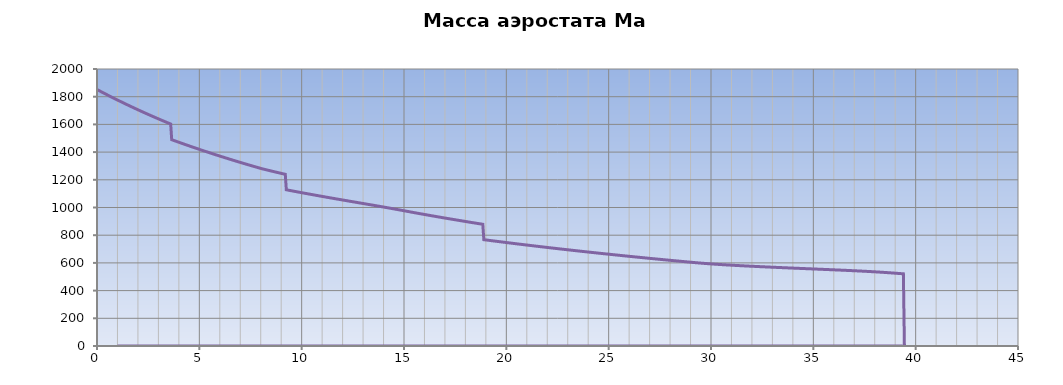
| Category | Масса аэростата Mа [кг] |
|---|---|
| 0.0 | 1851.845 |
| 0.05 | 1847.922 |
| 0.1 | 1844.015 |
| 0.15000000000000002 | 1840.122 |
| 0.2 | 1836.244 |
| 0.25 | 1832.381 |
| 0.3 | 1828.532 |
| 0.35 | 1824.697 |
| 0.39999999999999997 | 1820.877 |
| 0.44999999999999996 | 1817.072 |
| 0.49999999999999994 | 1813.28 |
| 0.5499999999999999 | 1809.503 |
| 0.6 | 1805.74 |
| 0.65 | 1801.99 |
| 0.7000000000000001 | 1798.255 |
| 0.7500000000000001 | 1794.533 |
| 0.8000000000000002 | 1790.825 |
| 0.8500000000000002 | 1787.13 |
| 0.9000000000000002 | 1783.449 |
| 0.9500000000000003 | 1779.782 |
| 1.0000000000000002 | 1776.128 |
| 1.0500000000000003 | 1772.487 |
| 1.1000000000000003 | 1768.859 |
| 1.1500000000000004 | 1765.245 |
| 1.2000000000000004 | 1761.643 |
| 1.2500000000000004 | 1758.055 |
| 1.3000000000000005 | 1754.479 |
| 1.3500000000000005 | 1750.916 |
| 1.4000000000000006 | 1747.366 |
| 1.4500000000000006 | 1743.829 |
| 1.5000000000000007 | 1740.304 |
| 1.5500000000000007 | 1736.791 |
| 1.6000000000000008 | 1733.292 |
| 1.6500000000000008 | 1729.804 |
| 1.7000000000000008 | 1726.329 |
| 1.7500000000000009 | 1722.866 |
| 1.800000000000001 | 1719.415 |
| 1.850000000000001 | 1715.976 |
| 1.900000000000001 | 1712.55 |
| 1.950000000000001 | 1709.135 |
| 2.000000000000001 | 1705.732 |
| 2.0500000000000007 | 1702.341 |
| 2.1000000000000005 | 1698.962 |
| 2.1500000000000004 | 1695.594 |
| 2.2 | 1692.238 |
| 2.25 | 1688.894 |
| 2.3 | 1685.561 |
| 2.3499999999999996 | 1682.24 |
| 2.3999999999999995 | 1678.929 |
| 2.4499999999999993 | 1675.631 |
| 2.499999999999999 | 1672.343 |
| 2.549999999999999 | 1669.067 |
| 2.5999999999999988 | 1665.801 |
| 2.6499999999999986 | 1662.547 |
| 2.6999999999999984 | 1659.304 |
| 2.7499999999999982 | 1656.072 |
| 2.799999999999998 | 1652.85 |
| 2.849999999999998 | 1649.64 |
| 2.8999999999999977 | 1646.44 |
| 2.9499999999999975 | 1643.251 |
| 2.9999999999999973 | 1640.072 |
| 3.049999999999997 | 1636.904 |
| 3.099999999999997 | 1633.747 |
| 3.149999999999997 | 1630.6 |
| 3.1999999999999966 | 1627.463 |
| 3.2499999999999964 | 1624.337 |
| 3.2999999999999963 | 1621.221 |
| 3.349999999999996 | 1618.116 |
| 3.399999999999996 | 1615.02 |
| 3.4499999999999957 | 1611.935 |
| 3.4999999999999956 | 1608.86 |
| 3.5499999999999954 | 1605.795 |
| 3.599999999999995 | 1602.74 |
| 3.649999999999995 | 1489.694 |
| 3.699999999999995 | 1487.003 |
| 3.7499999999999947 | 1484.321 |
| 3.7999999999999945 | 1481.646 |
| 3.8499999999999943 | 1478.979 |
| 3.899999999999994 | 1476.32 |
| 3.949999999999994 | 1473.67 |
| 3.999999999999994 | 1471.027 |
| 4.049999999999994 | 1468.392 |
| 4.099999999999993 | 1465.765 |
| 4.149999999999993 | 1463.145 |
| 4.199999999999993 | 1460.534 |
| 4.249999999999993 | 1457.93 |
| 4.299999999999993 | 1455.334 |
| 4.3499999999999925 | 1452.746 |
| 4.399999999999992 | 1450.165 |
| 4.449999999999992 | 1447.592 |
| 4.499999999999992 | 1445.027 |
| 4.549999999999992 | 1442.469 |
| 4.599999999999992 | 1439.918 |
| 4.6499999999999915 | 1437.375 |
| 4.699999999999991 | 1434.84 |
| 4.749999999999991 | 1432.312 |
| 4.799999999999991 | 1429.791 |
| 4.849999999999991 | 1427.278 |
| 4.899999999999991 | 1424.771 |
| 4.94999999999999 | 1422.273 |
| 4.99999999999999 | 1419.781 |
| 5.04999999999999 | 1417.297 |
| 5.09999999999999 | 1414.819 |
| 5.14999999999999 | 1412.349 |
| 5.1999999999999895 | 1409.886 |
| 5.249999999999989 | 1407.43 |
| 5.299999999999989 | 1404.981 |
| 5.349999999999989 | 1402.539 |
| 5.399999999999989 | 1400.105 |
| 5.449999999999989 | 1397.677 |
| 5.4999999999999885 | 1395.256 |
| 5.549999999999988 | 1392.841 |
| 5.599999999999988 | 1390.434 |
| 5.649999999999988 | 1388.034 |
| 5.699999999999988 | 1385.64 |
| 5.749999999999988 | 1383.253 |
| 5.799999999999987 | 1380.873 |
| 5.849999999999987 | 1378.5 |
| 5.899999999999987 | 1376.133 |
| 5.949999999999987 | 1373.773 |
| 5.999999999999987 | 1371.419 |
| 6.0499999999999865 | 1369.072 |
| 6.099999999999986 | 1366.732 |
| 6.149999999999986 | 1364.398 |
| 6.199999999999986 | 1362.071 |
| 6.249999999999986 | 1359.75 |
| 6.299999999999986 | 1357.436 |
| 6.349999999999985 | 1355.128 |
| 6.399999999999985 | 1352.827 |
| 6.449999999999985 | 1350.532 |
| 6.499999999999985 | 1348.243 |
| 6.549999999999985 | 1345.96 |
| 6.5999999999999845 | 1343.684 |
| 6.649999999999984 | 1341.414 |
| 6.699999999999984 | 1339.151 |
| 6.749999999999984 | 1336.893 |
| 6.799999999999984 | 1334.642 |
| 6.849999999999984 | 1332.397 |
| 6.8999999999999835 | 1330.158 |
| 6.949999999999983 | 1327.925 |
| 6.999999999999983 | 1325.698 |
| 7.049999999999983 | 1323.477 |
| 7.099999999999983 | 1321.263 |
| 7.149999999999983 | 1319.054 |
| 7.199999999999982 | 1316.851 |
| 7.249999999999982 | 1314.654 |
| 7.299999999999982 | 1312.464 |
| 7.349999999999982 | 1310.279 |
| 7.399999999999982 | 1308.1 |
| 7.4499999999999815 | 1305.927 |
| 7.499999999999981 | 1303.759 |
| 7.549999999999981 | 1301.598 |
| 7.599999999999981 | 1299.442 |
| 7.649999999999981 | 1297.292 |
| 7.699999999999981 | 1295.148 |
| 7.7499999999999805 | 1293.009 |
| 7.79999999999998 | 1290.876 |
| 7.84999999999998 | 1288.749 |
| 7.89999999999998 | 1286.628 |
| 7.94999999999998 | 1284.512 |
| 7.99999999999998 | 1282.402 |
| 8.04999999999998 | 1280.297 |
| 8.09999999999998 | 1278.468 |
| 8.14999999999998 | 1276.645 |
| 8.199999999999982 | 1274.828 |
| 8.249999999999982 | 1273.018 |
| 8.299999999999983 | 1271.213 |
| 8.349999999999984 | 1269.415 |
| 8.399999999999984 | 1267.622 |
| 8.449999999999985 | 1265.835 |
| 8.499999999999986 | 1264.054 |
| 8.549999999999986 | 1262.279 |
| 8.599999999999987 | 1260.509 |
| 8.649999999999988 | 1258.745 |
| 8.699999999999989 | 1256.986 |
| 8.74999999999999 | 1255.233 |
| 8.79999999999999 | 1253.485 |
| 8.84999999999999 | 1251.742 |
| 8.899999999999991 | 1250.005 |
| 8.949999999999992 | 1248.273 |
| 8.999999999999993 | 1246.546 |
| 9.049999999999994 | 1244.824 |
| 9.099999999999994 | 1243.108 |
| 9.149999999999995 | 1241.396 |
| 9.199999999999996 | 1239.689 |
| 9.249999999999996 | 1127.987 |
| 9.299999999999997 | 1126.562 |
| 9.349999999999998 | 1125.142 |
| 9.399999999999999 | 1123.725 |
| 9.45 | 1122.311 |
| 9.5 | 1120.902 |
| 9.55 | 1119.496 |
| 9.600000000000001 | 1118.093 |
| 9.650000000000002 | 1116.695 |
| 9.700000000000003 | 1115.299 |
| 9.750000000000004 | 1113.908 |
| 9.800000000000004 | 1112.519 |
| 9.850000000000005 | 1111.134 |
| 9.900000000000006 | 1109.753 |
| 9.950000000000006 | 1108.375 |
| 10.000000000000007 | 1107 |
| 10.050000000000008 | 1105.628 |
| 10.100000000000009 | 1104.26 |
| 10.15000000000001 | 1102.895 |
| 10.20000000000001 | 1101.533 |
| 10.25000000000001 | 1100.174 |
| 10.300000000000011 | 1098.818 |
| 10.350000000000012 | 1097.465 |
| 10.400000000000013 | 1096.115 |
| 10.450000000000014 | 1094.768 |
| 10.500000000000014 | 1093.424 |
| 10.550000000000015 | 1092.082 |
| 10.600000000000016 | 1090.744 |
| 10.650000000000016 | 1089.408 |
| 10.700000000000017 | 1088.075 |
| 10.750000000000018 | 1086.745 |
| 10.800000000000018 | 1085.417 |
| 10.85000000000002 | 1084.092 |
| 10.90000000000002 | 1082.769 |
| 10.95000000000002 | 1081.449 |
| 11.000000000000021 | 1080.132 |
| 11.050000000000022 | 1078.817 |
| 11.100000000000023 | 1077.504 |
| 11.150000000000023 | 1076.194 |
| 11.200000000000024 | 1074.886 |
| 11.250000000000025 | 1073.58 |
| 11.300000000000026 | 1072.276 |
| 11.350000000000026 | 1070.975 |
| 11.400000000000027 | 1069.676 |
| 11.450000000000028 | 1068.379 |
| 11.500000000000028 | 1067.083 |
| 11.55000000000003 | 1065.79 |
| 11.60000000000003 | 1064.499 |
| 11.65000000000003 | 1063.209 |
| 11.700000000000031 | 1061.922 |
| 11.750000000000032 | 1060.636 |
| 11.800000000000033 | 1059.352 |
| 11.850000000000033 | 1058.069 |
| 11.900000000000034 | 1056.788 |
| 11.950000000000035 | 1055.509 |
| 12.000000000000036 | 1054.231 |
| 12.050000000000036 | 1052.955 |
| 12.100000000000037 | 1051.68 |
| 12.150000000000038 | 1050.406 |
| 12.200000000000038 | 1049.133 |
| 12.250000000000039 | 1047.862 |
| 12.30000000000004 | 1046.592 |
| 12.35000000000004 | 1045.323 |
| 12.400000000000041 | 1044.054 |
| 12.450000000000042 | 1042.787 |
| 12.500000000000043 | 1041.52 |
| 12.550000000000043 | 1040.254 |
| 12.600000000000044 | 1038.989 |
| 12.650000000000045 | 1037.724 |
| 12.700000000000045 | 1036.46 |
| 12.750000000000046 | 1035.196 |
| 12.800000000000047 | 1033.933 |
| 12.850000000000048 | 1032.67 |
| 12.900000000000048 | 1031.406 |
| 12.950000000000049 | 1030.143 |
| 13.00000000000005 | 1028.88 |
| 13.05000000000005 | 1027.616 |
| 13.100000000000051 | 1026.352 |
| 13.150000000000052 | 1025.088 |
| 13.200000000000053 | 1023.823 |
| 13.250000000000053 | 1022.557 |
| 13.300000000000054 | 1021.291 |
| 13.350000000000055 | 1020.023 |
| 13.400000000000055 | 1018.755 |
| 13.450000000000056 | 1017.485 |
| 13.500000000000057 | 1016.213 |
| 13.550000000000058 | 1014.941 |
| 13.600000000000058 | 1013.666 |
| 13.650000000000059 | 1012.39 |
| 13.70000000000006 | 1011.111 |
| 13.75000000000006 | 1009.83 |
| 13.800000000000061 | 1008.547 |
| 13.850000000000062 | 1007.261 |
| 13.900000000000063 | 1005.972 |
| 13.950000000000063 | 1004.68 |
| 14.000000000000064 | 1003.385 |
| 14.050000000000065 | 1002.086 |
| 14.100000000000065 | 1000.784 |
| 14.150000000000066 | 999.478 |
| 14.200000000000067 | 998.167 |
| 14.250000000000068 | 996.853 |
| 14.300000000000068 | 995.533 |
| 14.350000000000069 | 994.209 |
| 14.40000000000007 | 992.88 |
| 14.45000000000007 | 991.547 |
| 14.500000000000071 | 990.208 |
| 14.550000000000072 | 988.863 |
| 14.600000000000072 | 987.514 |
| 14.650000000000073 | 986.16 |
| 14.700000000000074 | 984.801 |
| 14.750000000000075 | 983.437 |
| 14.800000000000075 | 982.07 |
| 14.850000000000076 | 980.699 |
| 14.900000000000077 | 979.326 |
| 14.950000000000077 | 977.952 |
| 15.000000000000078 | 976.579 |
| 15.050000000000079 | 975.206 |
| 15.10000000000008 | 973.836 |
| 15.15000000000008 | 972.468 |
| 15.200000000000081 | 971.104 |
| 15.250000000000082 | 969.742 |
| 15.300000000000082 | 968.383 |
| 15.350000000000083 | 967.028 |
| 15.400000000000084 | 965.675 |
| 15.450000000000085 | 964.325 |
| 15.500000000000085 | 962.977 |
| 15.550000000000086 | 961.633 |
| 15.600000000000087 | 960.292 |
| 15.650000000000087 | 958.953 |
| 15.700000000000088 | 957.617 |
| 15.750000000000089 | 956.284 |
| 15.80000000000009 | 954.954 |
| 15.85000000000009 | 953.627 |
| 15.900000000000091 | 952.303 |
| 15.950000000000092 | 950.981 |
| 16.000000000000092 | 949.662 |
| 16.050000000000093 | 948.346 |
| 16.100000000000094 | 947.033 |
| 16.150000000000095 | 945.722 |
| 16.200000000000095 | 944.414 |
| 16.250000000000096 | 943.109 |
| 16.300000000000097 | 941.807 |
| 16.350000000000097 | 940.508 |
| 16.400000000000098 | 939.211 |
| 16.4500000000001 | 937.917 |
| 16.5000000000001 | 936.625 |
| 16.5500000000001 | 935.337 |
| 16.6000000000001 | 934.051 |
| 16.6500000000001 | 932.767 |
| 16.700000000000102 | 931.487 |
| 16.750000000000103 | 930.209 |
| 16.800000000000104 | 928.933 |
| 16.850000000000104 | 927.661 |
| 16.900000000000105 | 926.391 |
| 16.950000000000106 | 925.123 |
| 17.000000000000107 | 923.859 |
| 17.050000000000107 | 922.597 |
| 17.100000000000108 | 921.337 |
| 17.15000000000011 | 920.08 |
| 17.20000000000011 | 918.826 |
| 17.25000000000011 | 917.574 |
| 17.30000000000011 | 916.325 |
| 17.35000000000011 | 915.078 |
| 17.400000000000112 | 913.834 |
| 17.450000000000113 | 912.593 |
| 17.500000000000114 | 911.354 |
| 17.550000000000114 | 910.118 |
| 17.600000000000115 | 908.884 |
| 17.650000000000116 | 907.653 |
| 17.700000000000117 | 906.424 |
| 17.750000000000117 | 905.198 |
| 17.800000000000118 | 903.974 |
| 17.85000000000012 | 902.753 |
| 17.90000000000012 | 901.534 |
| 17.95000000000012 | 900.318 |
| 18.00000000000012 | 899.104 |
| 18.05000000000012 | 897.893 |
| 18.100000000000122 | 896.684 |
| 18.150000000000123 | 895.478 |
| 18.200000000000124 | 894.274 |
| 18.250000000000124 | 893.072 |
| 18.300000000000125 | 891.873 |
| 18.350000000000126 | 890.676 |
| 18.400000000000126 | 889.482 |
| 18.450000000000127 | 888.29 |
| 18.500000000000128 | 887.101 |
| 18.55000000000013 | 885.914 |
| 18.60000000000013 | 884.73 |
| 18.65000000000013 | 883.547 |
| 18.70000000000013 | 882.368 |
| 18.75000000000013 | 881.19 |
| 18.800000000000132 | 880.015 |
| 18.850000000000133 | 878.842 |
| 18.900000000000134 | 767.672 |
| 18.950000000000134 | 766.715 |
| 19.000000000000135 | 765.761 |
| 19.050000000000136 | 764.808 |
| 19.100000000000136 | 763.857 |
| 19.150000000000137 | 762.907 |
| 19.200000000000138 | 761.96 |
| 19.25000000000014 | 761.014 |
| 19.30000000000014 | 760.069 |
| 19.35000000000014 | 759.127 |
| 19.40000000000014 | 758.186 |
| 19.45000000000014 | 757.247 |
| 19.500000000000142 | 756.31 |
| 19.550000000000143 | 755.374 |
| 19.600000000000144 | 754.44 |
| 19.650000000000144 | 753.508 |
| 19.700000000000145 | 752.578 |
| 19.750000000000146 | 751.649 |
| 19.800000000000146 | 750.722 |
| 19.850000000000147 | 749.796 |
| 19.900000000000148 | 748.873 |
| 19.95000000000015 | 747.951 |
| 20.00000000000015 | 747.03 |
| 20.05000000000015 | 746.112 |
| 20.10000000000015 | 745.195 |
| 20.15000000000015 | 744.279 |
| 20.200000000000152 | 743.366 |
| 20.250000000000153 | 742.453 |
| 20.300000000000153 | 741.543 |
| 20.350000000000154 | 740.634 |
| 20.400000000000155 | 739.727 |
| 20.450000000000156 | 738.822 |
| 20.500000000000156 | 737.918 |
| 20.550000000000157 | 737.016 |
| 20.600000000000158 | 736.115 |
| 20.65000000000016 | 735.216 |
| 20.70000000000016 | 734.319 |
| 20.75000000000016 | 733.423 |
| 20.80000000000016 | 732.529 |
| 20.85000000000016 | 731.636 |
| 20.900000000000162 | 730.745 |
| 20.950000000000163 | 729.856 |
| 21.000000000000163 | 728.968 |
| 21.050000000000164 | 728.082 |
| 21.100000000000165 | 727.198 |
| 21.150000000000166 | 726.315 |
| 21.200000000000166 | 725.433 |
| 21.250000000000167 | 724.553 |
| 21.300000000000168 | 723.675 |
| 21.35000000000017 | 722.798 |
| 21.40000000000017 | 721.923 |
| 21.45000000000017 | 721.05 |
| 21.50000000000017 | 720.178 |
| 21.55000000000017 | 719.307 |
| 21.600000000000172 | 718.438 |
| 21.650000000000173 | 717.571 |
| 21.700000000000173 | 716.705 |
| 21.750000000000174 | 715.841 |
| 21.800000000000175 | 714.978 |
| 21.850000000000176 | 714.117 |
| 21.900000000000176 | 713.257 |
| 21.950000000000177 | 712.399 |
| 22.000000000000178 | 711.542 |
| 22.05000000000018 | 710.687 |
| 22.10000000000018 | 709.833 |
| 22.15000000000018 | 708.981 |
| 22.20000000000018 | 708.13 |
| 22.25000000000018 | 707.281 |
| 22.300000000000182 | 706.433 |
| 22.350000000000183 | 705.587 |
| 22.400000000000183 | 704.742 |
| 22.450000000000184 | 703.899 |
| 22.500000000000185 | 703.057 |
| 22.550000000000185 | 702.217 |
| 22.600000000000186 | 701.378 |
| 22.650000000000187 | 700.541 |
| 22.700000000000188 | 699.705 |
| 22.75000000000019 | 698.871 |
| 22.80000000000019 | 698.038 |
| 22.85000000000019 | 697.206 |
| 22.90000000000019 | 696.376 |
| 22.95000000000019 | 695.547 |
| 23.000000000000192 | 694.72 |
| 23.050000000000193 | 693.895 |
| 23.100000000000193 | 693.07 |
| 23.150000000000194 | 692.247 |
| 23.200000000000195 | 691.426 |
| 23.250000000000195 | 690.606 |
| 23.300000000000196 | 689.787 |
| 23.350000000000197 | 688.97 |
| 23.400000000000198 | 688.155 |
| 23.4500000000002 | 687.34 |
| 23.5000000000002 | 686.527 |
| 23.5500000000002 | 685.716 |
| 23.6000000000002 | 684.906 |
| 23.6500000000002 | 684.097 |
| 23.700000000000202 | 683.29 |
| 23.750000000000203 | 682.484 |
| 23.800000000000203 | 681.679 |
| 23.850000000000204 | 680.876 |
| 23.900000000000205 | 680.074 |
| 23.950000000000205 | 679.274 |
| 24.000000000000206 | 678.475 |
| 24.050000000000207 | 677.677 |
| 24.100000000000207 | 676.881 |
| 24.150000000000208 | 676.086 |
| 24.20000000000021 | 675.292 |
| 24.25000000000021 | 674.5 |
| 24.30000000000021 | 673.709 |
| 24.35000000000021 | 672.92 |
| 24.40000000000021 | 672.132 |
| 24.450000000000212 | 671.345 |
| 24.500000000000213 | 670.56 |
| 24.550000000000214 | 669.775 |
| 24.600000000000215 | 668.993 |
| 24.650000000000215 | 668.211 |
| 24.700000000000216 | 667.431 |
| 24.750000000000217 | 666.652 |
| 24.800000000000217 | 665.875 |
| 24.850000000000218 | 665.099 |
| 24.90000000000022 | 664.324 |
| 24.95000000000022 | 663.551 |
| 25.00000000000022 | 662.778 |
| 25.05000000000022 | 662.008 |
| 25.10000000000022 | 661.238 |
| 25.150000000000222 | 660.47 |
| 25.200000000000223 | 659.703 |
| 25.250000000000224 | 658.937 |
| 25.300000000000225 | 658.173 |
| 25.350000000000225 | 657.41 |
| 25.400000000000226 | 656.648 |
| 25.450000000000227 | 655.887 |
| 25.500000000000227 | 655.128 |
| 25.550000000000228 | 654.37 |
| 25.60000000000023 | 653.613 |
| 25.65000000000023 | 652.858 |
| 25.70000000000023 | 652.104 |
| 25.75000000000023 | 651.351 |
| 25.80000000000023 | 650.6 |
| 25.850000000000232 | 649.849 |
| 25.900000000000233 | 649.1 |
| 25.950000000000234 | 648.352 |
| 26.000000000000234 | 647.606 |
| 26.050000000000235 | 646.86 |
| 26.100000000000236 | 646.116 |
| 26.150000000000237 | 645.373 |
| 26.200000000000237 | 644.632 |
| 26.250000000000238 | 643.892 |
| 26.30000000000024 | 643.152 |
| 26.35000000000024 | 642.415 |
| 26.40000000000024 | 641.678 |
| 26.45000000000024 | 640.942 |
| 26.50000000000024 | 640.208 |
| 26.550000000000242 | 639.475 |
| 26.600000000000243 | 638.744 |
| 26.650000000000244 | 638.013 |
| 26.700000000000244 | 637.284 |
| 26.750000000000245 | 636.556 |
| 26.800000000000246 | 635.829 |
| 26.850000000000247 | 635.103 |
| 26.900000000000247 | 634.378 |
| 26.950000000000248 | 633.655 |
| 27.00000000000025 | 632.933 |
| 27.05000000000025 | 632.212 |
| 27.10000000000025 | 631.492 |
| 27.15000000000025 | 630.774 |
| 27.20000000000025 | 630.056 |
| 27.250000000000252 | 629.34 |
| 27.300000000000253 | 628.625 |
| 27.350000000000254 | 627.911 |
| 27.400000000000254 | 627.199 |
| 27.450000000000255 | 626.487 |
| 27.500000000000256 | 625.777 |
| 27.550000000000257 | 625.068 |
| 27.600000000000257 | 624.36 |
| 27.650000000000258 | 623.653 |
| 27.70000000000026 | 622.948 |
| 27.75000000000026 | 622.243 |
| 27.80000000000026 | 621.54 |
| 27.85000000000026 | 620.838 |
| 27.90000000000026 | 620.137 |
| 27.950000000000262 | 619.437 |
| 28.000000000000263 | 618.738 |
| 28.050000000000264 | 618.04 |
| 28.100000000000264 | 617.344 |
| 28.150000000000265 | 616.648 |
| 28.200000000000266 | 615.954 |
| 28.250000000000266 | 615.261 |
| 28.300000000000267 | 614.569 |
| 28.350000000000268 | 613.878 |
| 28.40000000000027 | 613.189 |
| 28.45000000000027 | 612.5 |
| 28.50000000000027 | 611.813 |
| 28.55000000000027 | 611.126 |
| 28.60000000000027 | 610.441 |
| 28.650000000000272 | 609.757 |
| 28.700000000000273 | 609.074 |
| 28.750000000000274 | 608.392 |
| 28.800000000000274 | 607.711 |
| 28.850000000000275 | 607.032 |
| 28.900000000000276 | 606.353 |
| 28.950000000000276 | 605.676 |
| 29.000000000000277 | 604.999 |
| 29.050000000000278 | 604.325 |
| 29.10000000000028 | 603.653 |
| 29.15000000000028 | 602.986 |
| 29.20000000000028 | 602.323 |
| 29.25000000000028 | 601.667 |
| 29.30000000000028 | 601.017 |
| 29.350000000000282 | 600.376 |
| 29.400000000000283 | 599.743 |
| 29.450000000000284 | 599.119 |
| 29.500000000000284 | 598.504 |
| 29.550000000000285 | 597.898 |
| 29.600000000000286 | 597.301 |
| 29.650000000000286 | 596.712 |
| 29.700000000000287 | 596.133 |
| 29.750000000000288 | 595.563 |
| 29.80000000000029 | 595 |
| 29.85000000000029 | 594.447 |
| 29.90000000000029 | 593.901 |
| 29.95000000000029 | 593.363 |
| 30.00000000000029 | 592.833 |
| 30.050000000000292 | 592.31 |
| 30.100000000000293 | 591.794 |
| 30.150000000000293 | 591.286 |
| 30.200000000000294 | 590.784 |
| 30.250000000000295 | 590.288 |
| 30.300000000000296 | 589.799 |
| 30.350000000000296 | 589.315 |
| 30.400000000000297 | 588.838 |
| 30.450000000000298 | 588.366 |
| 30.5000000000003 | 587.9 |
| 30.5500000000003 | 587.439 |
| 30.6000000000003 | 586.983 |
| 30.6500000000003 | 586.532 |
| 30.7000000000003 | 586.086 |
| 30.750000000000302 | 585.645 |
| 30.800000000000303 | 585.208 |
| 30.850000000000303 | 584.775 |
| 30.900000000000304 | 584.347 |
| 30.950000000000305 | 583.922 |
| 31.000000000000306 | 583.502 |
| 31.050000000000306 | 583.085 |
| 31.100000000000307 | 582.672 |
| 31.150000000000308 | 582.263 |
| 31.20000000000031 | 581.857 |
| 31.25000000000031 | 581.455 |
| 31.30000000000031 | 581.056 |
| 31.35000000000031 | 580.66 |
| 31.40000000000031 | 580.267 |
| 31.450000000000312 | 579.877 |
| 31.500000000000313 | 579.49 |
| 31.550000000000313 | 579.105 |
| 31.600000000000314 | 578.724 |
| 31.650000000000315 | 578.345 |
| 31.700000000000315 | 577.969 |
| 31.750000000000316 | 577.595 |
| 31.800000000000317 | 577.224 |
| 31.850000000000318 | 576.855 |
| 31.90000000000032 | 576.488 |
| 31.95000000000032 | 576.124 |
| 32.00000000000032 | 575.761 |
| 32.05000000000032 | 575.401 |
| 32.100000000000314 | 575.043 |
| 32.15000000000031 | 574.687 |
| 32.20000000000031 | 574.333 |
| 32.250000000000306 | 573.98 |
| 32.3000000000003 | 573.63 |
| 32.3500000000003 | 573.281 |
| 32.4000000000003 | 572.934 |
| 32.450000000000294 | 572.588 |
| 32.50000000000029 | 572.245 |
| 32.55000000000029 | 571.903 |
| 32.600000000000286 | 571.562 |
| 32.65000000000028 | 571.223 |
| 32.70000000000028 | 570.885 |
| 32.75000000000028 | 570.549 |
| 32.800000000000274 | 570.214 |
| 32.85000000000027 | 569.88 |
| 32.90000000000027 | 569.548 |
| 32.950000000000266 | 569.217 |
| 33.00000000000026 | 568.887 |
| 33.05000000000026 | 568.558 |
| 33.10000000000026 | 568.23 |
| 33.150000000000254 | 567.904 |
| 33.20000000000025 | 567.578 |
| 33.25000000000025 | 567.254 |
| 33.300000000000246 | 566.93 |
| 33.35000000000024 | 566.608 |
| 33.40000000000024 | 566.286 |
| 33.45000000000024 | 565.965 |
| 33.500000000000234 | 565.645 |
| 33.55000000000023 | 565.326 |
| 33.60000000000023 | 565.008 |
| 33.650000000000226 | 564.69 |
| 33.70000000000022 | 564.373 |
| 33.75000000000022 | 564.057 |
| 33.80000000000022 | 563.742 |
| 33.850000000000215 | 563.427 |
| 33.90000000000021 | 563.113 |
| 33.95000000000021 | 562.799 |
| 34.000000000000206 | 562.486 |
| 34.0500000000002 | 562.173 |
| 34.1000000000002 | 561.861 |
| 34.1500000000002 | 561.549 |
| 34.200000000000195 | 561.238 |
| 34.25000000000019 | 560.927 |
| 34.30000000000019 | 560.616 |
| 34.350000000000186 | 560.306 |
| 34.40000000000018 | 559.996 |
| 34.45000000000018 | 559.686 |
| 34.50000000000018 | 559.376 |
| 34.550000000000175 | 559.067 |
| 34.60000000000017 | 558.758 |
| 34.65000000000017 | 558.449 |
| 34.700000000000166 | 558.14 |
| 34.75000000000016 | 557.831 |
| 34.80000000000016 | 557.522 |
| 34.85000000000016 | 557.213 |
| 34.900000000000155 | 556.904 |
| 34.95000000000015 | 556.595 |
| 35.00000000000015 | 556.286 |
| 35.050000000000146 | 555.977 |
| 35.10000000000014 | 555.667 |
| 35.15000000000014 | 555.358 |
| 35.20000000000014 | 555.048 |
| 35.250000000000135 | 554.738 |
| 35.30000000000013 | 554.427 |
| 35.35000000000013 | 554.117 |
| 35.40000000000013 | 553.806 |
| 35.450000000000124 | 553.494 |
| 35.50000000000012 | 553.182 |
| 35.55000000000012 | 552.869 |
| 35.600000000000115 | 552.556 |
| 35.65000000000011 | 552.242 |
| 35.70000000000011 | 551.928 |
| 35.75000000000011 | 551.613 |
| 35.800000000000104 | 551.297 |
| 35.8500000000001 | 550.981 |
| 35.9000000000001 | 550.663 |
| 35.950000000000095 | 550.345 |
| 36.00000000000009 | 550.026 |
| 36.05000000000009 | 549.705 |
| 36.10000000000009 | 549.384 |
| 36.150000000000084 | 549.062 |
| 36.20000000000008 | 548.738 |
| 36.25000000000008 | 548.413 |
| 36.300000000000075 | 548.087 |
| 36.35000000000007 | 547.76 |
| 36.40000000000007 | 547.431 |
| 36.45000000000007 | 547.101 |
| 36.500000000000064 | 546.769 |
| 36.55000000000006 | 546.436 |
| 36.60000000000006 | 546.101 |
| 36.650000000000055 | 545.764 |
| 36.70000000000005 | 545.425 |
| 36.75000000000005 | 545.085 |
| 36.80000000000005 | 544.742 |
| 36.850000000000044 | 544.397 |
| 36.90000000000004 | 544.05 |
| 36.95000000000004 | 543.701 |
| 37.000000000000036 | 543.349 |
| 37.05000000000003 | 542.995 |
| 37.10000000000003 | 542.638 |
| 37.15000000000003 | 542.278 |
| 37.200000000000024 | 541.916 |
| 37.25000000000002 | 541.551 |
| 37.30000000000002 | 541.182 |
| 37.350000000000016 | 540.811 |
| 37.40000000000001 | 540.436 |
| 37.45000000000001 | 540.057 |
| 37.50000000000001 | 539.675 |
| 37.550000000000004 | 539.289 |
| 37.6 | 538.899 |
| 37.65 | 538.505 |
| 37.699999999999996 | 538.106 |
| 37.74999999999999 | 537.703 |
| 37.79999999999999 | 537.296 |
| 37.84999999999999 | 536.883 |
| 37.899999999999984 | 536.466 |
| 37.94999999999998 | 536.043 |
| 37.99999999999998 | 535.615 |
| 38.049999999999976 | 535.181 |
| 38.09999999999997 | 534.741 |
| 38.14999999999997 | 534.295 |
| 38.19999999999997 | 533.843 |
| 38.249999999999964 | 533.385 |
| 38.29999999999996 | 532.919 |
| 38.34999999999996 | 532.447 |
| 38.399999999999956 | 531.968 |
| 38.44999999999995 | 531.481 |
| 38.49999999999995 | 530.987 |
| 38.54999999999995 | 530.486 |
| 38.599999999999945 | 529.978 |
| 38.64999999999994 | 529.462 |
| 38.69999999999994 | 528.939 |
| 38.749999999999936 | 528.41 |
| 38.79999999999993 | 527.875 |
| 38.84999999999993 | 527.335 |
| 38.89999999999993 | 526.79 |
| 38.949999999999925 | 526.242 |
| 38.99999999999992 | 525.692 |
| 39.04999999999992 | 525.141 |
| 39.099999999999916 | 524.59 |
| 39.14999999999991 | 524.039 |
| 39.19999999999991 | 523.49 |
| 39.24999999999991 | 522.941 |
| 39.299999999999905 | 522.394 |
| 39.3499999999999 | 521.847 |
| 39.3999999999999 | 521.301 |
| 39.449999999999896 | 0 |
| 1.0 | 0 |
| 1.0 | 0 |
| 1.0 | 0 |
| 1.0 | 0 |
| 1.0 | 0 |
| 1.0 | 0 |
| 1.0 | 0 |
| 1.0 | 0 |
| 1.0 | 0 |
| 1.0 | 0 |
| 1.0 | 0 |
| 1.0 | 0 |
| 1.0 | 0 |
| 1.0 | 0 |
| 1.0 | 0 |
| 1.0 | 0 |
| 1.0 | 0 |
| 1.0 | 0 |
| 1.0 | 0 |
| 1.0 | 0 |
| 1.0 | 0 |
| 1.0 | 0 |
| 1.0 | 0 |
| 1.0 | 0 |
| 1.0 | 0 |
| 1.0 | 0 |
| 1.0 | 0 |
| 1.0 | 0 |
| 1.0 | 0 |
| 1.0 | 0 |
| 1.0 | 0 |
| 1.0 | 0 |
| 1.0 | 0 |
| 1.0 | 0 |
| 1.0 | 0 |
| 1.0 | 0 |
| 1.0 | 0 |
| 1.0 | 0 |
| 1.0 | 0 |
| 1.0 | 0 |
| 1.0 | 0 |
| 1.0 | 0 |
| 1.0 | 0 |
| 1.0 | 0 |
| 1.0 | 0 |
| 1.0 | 0 |
| 1.0 | 0 |
| 1.0 | 0 |
| 1.0 | 0 |
| 1.0 | 0 |
| 1.0 | 0 |
| 1.0 | 0 |
| 1.0 | 0 |
| 1.0 | 0 |
| 1.0 | 0 |
| 1.0 | 0 |
| 1.0 | 0 |
| 1.0 | 0 |
| 1.0 | 0 |
| 1.0 | 0 |
| 1.0 | 0 |
| 1.0 | 0 |
| 1.0 | 0 |
| 1.0 | 0 |
| 1.0 | 0 |
| 1.0 | 0 |
| 1.0 | 0 |
| 1.0 | 0 |
| 1.0 | 0 |
| 1.0 | 0 |
| 1.0 | 0 |
| 1.0 | 0 |
| 1.0 | 0 |
| 1.0 | 0 |
| 1.0 | 0 |
| 1.0 | 0 |
| 1.0 | 0 |
| 1.0 | 0 |
| 1.0 | 0 |
| 1.0 | 0 |
| 1.0 | 0 |
| 1.0 | 0 |
| 1.0 | 0 |
| 1.0 | 0 |
| 1.0 | 0 |
| 1.0 | 0 |
| 1.0 | 0 |
| 1.0 | 0 |
| 1.0 | 0 |
| 1.0 | 0 |
| 1.0 | 0 |
| 1.0 | 0 |
| 1.0 | 0 |
| 1.0 | 0 |
| 1.0 | 0 |
| 1.0 | 0 |
| 1.0 | 0 |
| 1.0 | 0 |
| 1.0 | 0 |
| 1.0 | 0 |
| 1.0 | 0 |
| 1.0 | 0 |
| 1.0 | 0 |
| 1.0 | 0 |
| 1.0 | 0 |
| 1.0 | 0 |
| 1.0 | 0 |
| 1.0 | 0 |
| 1.0 | 0 |
| 1.0 | 0 |
| 1.0 | 0 |
| 1.0 | 0 |
| 1.0 | 0 |
| 1.0 | 0 |
| 1.0 | 0 |
| 1.0 | 0 |
| 1.0 | 0 |
| 1.0 | 0 |
| 1.0 | 0 |
| 1.0 | 0 |
| 1.0 | 0 |
| 1.0 | 0 |
| 1.0 | 0 |
| 1.0 | 0 |
| 1.0 | 0 |
| 1.0 | 0 |
| 1.0 | 0 |
| 1.0 | 0 |
| 1.0 | 0 |
| 1.0 | 0 |
| 1.0 | 0 |
| 1.0 | 0 |
| 1.0 | 0 |
| 1.0 | 0 |
| 1.0 | 0 |
| 1.0 | 0 |
| 1.0 | 0 |
| 1.0 | 0 |
| 1.0 | 0 |
| 1.0 | 0 |
| 1.0 | 0 |
| 1.0 | 0 |
| 1.0 | 0 |
| 1.0 | 0 |
| 1.0 | 0 |
| 1.0 | 0 |
| 1.0 | 0 |
| 1.0 | 0 |
| 1.0 | 0 |
| 1.0 | 0 |
| 1.0 | 0 |
| 1.0 | 0 |
| 1.0 | 0 |
| 1.0 | 0 |
| 1.0 | 0 |
| 1.0 | 0 |
| 1.0 | 0 |
| 1.0 | 0 |
| 1.0 | 0 |
| 1.0 | 0 |
| 1.0 | 0 |
| 1.0 | 0 |
| 1.0 | 0 |
| 1.0 | 0 |
| 1.0 | 0 |
| 1.0 | 0 |
| 1.0 | 0 |
| 1.0 | 0 |
| 1.0 | 0 |
| 1.0 | 0 |
| 1.0 | 0 |
| 1.0 | 0 |
| 1.0 | 0 |
| 1.0 | 0 |
| 1.0 | 0 |
| 1.0 | 0 |
| 1.0 | 0 |
| 1.0 | 0 |
| 1.0 | 0 |
| 1.0 | 0 |
| 1.0 | 0 |
| 1.0 | 0 |
| 1.0 | 0 |
| 1.0 | 0 |
| 1.0 | 0 |
| 1.0 | 0 |
| 1.0 | 0 |
| 1.0 | 0 |
| 1.0 | 0 |
| 1.0 | 0 |
| 1.0 | 0 |
| 1.0 | 0 |
| 1.0 | 0 |
| 1.0 | 0 |
| 1.0 | 0 |
| 1.0 | 0 |
| 1.0 | 0 |
| 1.0 | 0 |
| 1.0 | 0 |
| 1.0 | 0 |
| 1.0 | 0 |
| 1.0 | 0 |
| 1.0 | 0 |
| 1.0 | 0 |
| 1.0 | 0 |
| 1.0 | 0 |
| 1.0 | 0 |
| 1.0 | 0 |
| 1.0 | 0 |
| 1.0 | 0 |
| 1.0 | 0 |
| 1.0 | 0 |
| 1.0 | 0 |
| 1.0 | 0 |
| 1.0 | 0 |
| 1.0 | 0 |
| 1.0 | 0 |
| 1.0 | 0 |
| 1.0 | 0 |
| 1.0 | 0 |
| 1.0 | 0 |
| 1.0 | 0 |
| 1.0 | 0 |
| 1.0 | 0 |
| 1.0 | 0 |
| 1.0 | 0 |
| 1.0 | 0 |
| 1.0 | 0 |
| 1.0 | 0 |
| 1.0 | 0 |
| 1.0 | 0 |
| 1.0 | 0 |
| 1.0 | 0 |
| 1.0 | 0 |
| 1.0 | 0 |
| 1.0 | 0 |
| 1.0 | 0 |
| 1.0 | 0 |
| 1.0 | 0 |
| 1.0 | 0 |
| 1.0 | 0 |
| 1.0 | 0 |
| 1.0 | 0 |
| 1.0 | 0 |
| 1.0 | 0 |
| 1.0 | 0 |
| 1.0 | 0 |
| 1.0 | 0 |
| 1.0 | 0 |
| 1.0 | 0 |
| 1.0 | 0 |
| 1.0 | 0 |
| 1.0 | 0 |
| 1.0 | 0 |
| 1.0 | 0 |
| 1.0 | 0 |
| 1.0 | 0 |
| 1.0 | 0 |
| 1.0 | 0 |
| 1.0 | 0 |
| 1.0 | 0 |
| 1.0 | 0 |
| 1.0 | 0 |
| 1.0 | 0 |
| 1.0 | 0 |
| 1.0 | 0 |
| 1.0 | 0 |
| 1.0 | 0 |
| 1.0 | 0 |
| 1.0 | 0 |
| 1.0 | 0 |
| 1.0 | 0 |
| 1.0 | 0 |
| 1.0 | 0 |
| 1.0 | 0 |
| 1.0 | 0 |
| 1.0 | 0 |
| 1.0 | 0 |
| 1.0 | 0 |
| 1.0 | 0 |
| 1.0 | 0 |
| 1.0 | 0 |
| 1.0 | 0 |
| 1.0 | 0 |
| 1.0 | 0 |
| 1.0 | 0 |
| 1.0 | 0 |
| 1.0 | 0 |
| 1.0 | 0 |
| 1.0 | 0 |
| 1.0 | 0 |
| 1.0 | 0 |
| 1.0 | 0 |
| 1.0 | 0 |
| 1.0 | 0 |
| 1.0 | 0 |
| 1.0 | 0 |
| 1.0 | 0 |
| 1.0 | 0 |
| 1.0 | 0 |
| 1.0 | 0 |
| 1.0 | 0 |
| 1.0 | 0 |
| 1.0 | 0 |
| 1.0 | 0 |
| 1.0 | 0 |
| 1.0 | 0 |
| 1.0 | 0 |
| 1.0 | 0 |
| 1.0 | 0 |
| 1.0 | 0 |
| 1.0 | 0 |
| 1.0 | 0 |
| 1.0 | 0 |
| 1.0 | 0 |
| 1.0 | 0 |
| 1.0 | 0 |
| 1.0 | 0 |
| 1.0 | 0 |
| 1.0 | 0 |
| 1.0 | 0 |
| 1.0 | 0 |
| 1.0 | 0 |
| 1.0 | 0 |
| 1.0 | 0 |
| 1.0 | 0 |
| 1.0 | 0 |
| 1.0 | 0 |
| 1.0 | 0 |
| 1.0 | 0 |
| 1.0 | 0 |
| 1.0 | 0 |
| 1.0 | 0 |
| 1.0 | 0 |
| 1.0 | 0 |
| 1.0 | 0 |
| 1.0 | 0 |
| 1.0 | 0 |
| 1.0 | 0 |
| 1.0 | 0 |
| 1.0 | 0 |
| 1.0 | 0 |
| 1.0 | 0 |
| 1.0 | 0 |
| 1.0 | 0 |
| 1.0 | 0 |
| 1.0 | 0 |
| 1.0 | 0 |
| 1.0 | 0 |
| 1.0 | 0 |
| 1.0 | 0 |
| 1.0 | 0 |
| 1.0 | 0 |
| 1.0 | 0 |
| 1.0 | 0 |
| 1.0 | 0 |
| 1.0 | 0 |
| 1.0 | 0 |
| 1.0 | 0 |
| 1.0 | 0 |
| 1.0 | 0 |
| 1.0 | 0 |
| 1.0 | 0 |
| 1.0 | 0 |
| 1.0 | 0 |
| 1.0 | 0 |
| 1.0 | 0 |
| 1.0 | 0 |
| 1.0 | 0 |
| 1.0 | 0 |
| 1.0 | 0 |
| 1.0 | 0 |
| 1.0 | 0 |
| 1.0 | 0 |
| 1.0 | 0 |
| 1.0 | 0 |
| 1.0 | 0 |
| 1.0 | 0 |
| 1.0 | 0 |
| 1.0 | 0 |
| 1.0 | 0 |
| 1.0 | 0 |
| 1.0 | 0 |
| 1.0 | 0 |
| 1.0 | 0 |
| 1.0 | 0 |
| 1.0 | 0 |
| 1.0 | 0 |
| 1.0 | 0 |
| 1.0 | 0 |
| 1.0 | 0 |
| 1.0 | 0 |
| 1.0 | 0 |
| 1.0 | 0 |
| 1.0 | 0 |
| 1.0 | 0 |
| 1.0 | 0 |
| 1.0 | 0 |
| 1.0 | 0 |
| 1.0 | 0 |
| 1.0 | 0 |
| 1.0 | 0 |
| 1.0 | 0 |
| 1.0 | 0 |
| 1.0 | 0 |
| 1.0 | 0 |
| 1.0 | 0 |
| 1.0 | 0 |
| 1.0 | 0 |
| 1.0 | 0 |
| 1.0 | 0 |
| 1.0 | 0 |
| 1.0 | 0 |
| 1.0 | 0 |
| 1.0 | 0 |
| 1.0 | 0 |
| 1.0 | 0 |
| 1.0 | 0 |
| 1.0 | 0 |
| 1.0 | 0 |
| 1.0 | 0 |
| 1.0 | 0 |
| 1.0 | 0 |
| 1.0 | 0 |
| 1.0 | 0 |
| 1.0 | 0 |
| 1.0 | 0 |
| 1.0 | 0 |
| 1.0 | 0 |
| 1.0 | 0 |
| 1.0 | 0 |
| 1.0 | 0 |
| 1.0 | 0 |
| 1.0 | 0 |
| 1.0 | 0 |
| 1.0 | 0 |
| 1.0 | 0 |
| 1.0 | 0 |
| 1.0 | 0 |
| 1.0 | 0 |
| 1.0 | 0 |
| 1.0 | 0 |
| 1.0 | 0 |
| 1.0 | 0 |
| 1.0 | 0 |
| 1.0 | 0 |
| 1.0 | 0 |
| 1.0 | 0 |
| 1.0 | 0 |
| 1.0 | 0 |
| 1.0 | 0 |
| 1.0 | 0 |
| 1.0 | 0 |
| 1.0 | 0 |
| 1.0 | 0 |
| 1.0 | 0 |
| 1.0 | 0 |
| 1.0 | 0 |
| 1.0 | 0 |
| 1.0 | 0 |
| 1.0 | 0 |
| 1.0 | 0 |
| 1.0 | 0 |
| 1.0 | 0 |
| 1.0 | 0 |
| 1.0 | 0 |
| 1.0 | 0 |
| 1.0 | 0 |
| 1.0 | 0 |
| 1.0 | 0 |
| 1.0 | 0 |
| 1.0 | 0 |
| 1.0 | 0 |
| 1.0 | 0 |
| 1.0 | 0 |
| 1.0 | 0 |
| 1.0 | 0 |
| 1.0 | 0 |
| 1.0 | 0 |
| 1.0 | 0 |
| 1.0 | 0 |
| 1.0 | 0 |
| 1.0 | 0 |
| 1.0 | 0 |
| 1.0 | 0 |
| 1.0 | 0 |
| 1.0 | 0 |
| 1.0 | 0 |
| 1.0 | 0 |
| 1.0 | 0 |
| 1.0 | 0 |
| 1.0 | 0 |
| 1.0 | 0 |
| 1.0 | 0 |
| 1.0 | 0 |
| 1.0 | 0 |
| 1.0 | 0 |
| 1.0 | 0 |
| 1.0 | 0 |
| 1.0 | 0 |
| 1.0 | 0 |
| 1.0 | 0 |
| 1.0 | 0 |
| 1.0 | 0 |
| 1.0 | 0 |
| 1.0 | 0 |
| 1.0 | 0 |
| 1.0 | 0 |
| 1.0 | 0 |
| 1.0 | 0 |
| 1.0 | 0 |